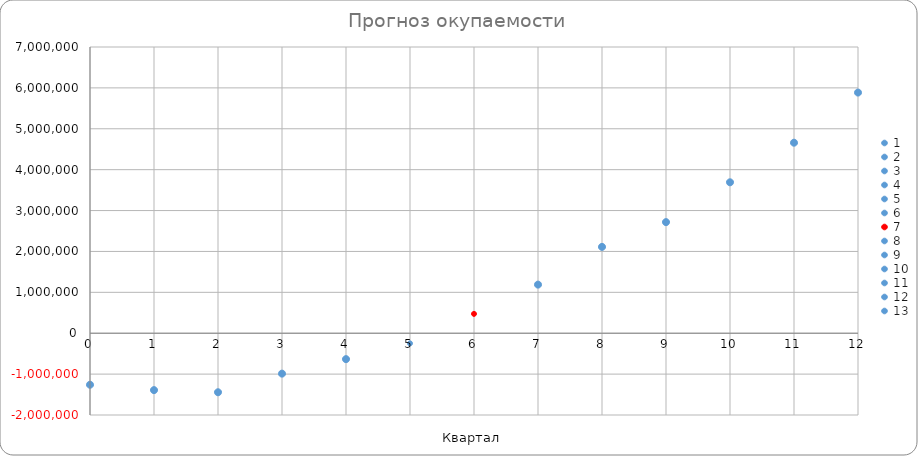
| Category | Автомобили в лизинге |
|---|---|
| 0.0 | -1259610 |
| 1.0 | -1391753.688 |
| 2.0 | -1443815.838 |
| 3.0 | -988219.612 |
| 4.0 | -634035.888 |
| 5.0 | -248118.887 |
| 6.0 | 473222.712 |
| 7.0 | 1188964.312 |
| 8.0 | 2111707.812 |
| 9.0 | 2716783.752 |
| 10.0 | 3691001.052 |
| 11.0 | 4659618.352 |
| 12.0 | 5885812.692 |